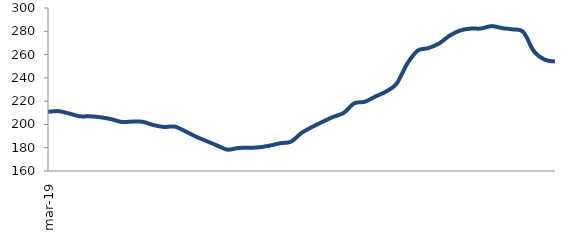
| Category | Series 0 |
|---|---|
| 2019-03-01 | 210.872 |
| 2019-04-01 | 211.394 |
| 2019-05-01 | 209.393 |
| 2019-06-01 | 207.032 |
| 2019-07-01 | 206.974 |
| 2019-08-01 | 206.107 |
| 2019-09-01 | 204.488 |
| 2019-10-01 | 202.111 |
| 2019-11-01 | 202.424 |
| 2019-12-01 | 202.177 |
| 2020-01-01 | 199.409 |
| 2020-02-01 | 197.826 |
| 2020-03-01 | 198.161 |
| 2020-04-01 | 194.123 |
| 2020-05-01 | 189.538 |
| 2020-06-01 | 185.731 |
| 2020-07-01 | 181.914 |
| 2020-08-01 | 178.343 |
| 2020-09-01 | 179.758 |
| 2020-10-01 | 179.9 |
| 2020-11-01 | 180.346 |
| 2020-12-01 | 181.827 |
| 2021-01-01 | 183.909 |
| 2021-02-01 | 185.191 |
| 2021-03-01 | 192.66 |
| 2021-04-01 | 197.814 |
| 2021-05-01 | 202.28 |
| 2021-06-01 | 206.474 |
| 2021-07-01 | 209.951 |
| 2021-08-01 | 218.146 |
| 2021-09-01 | 219.495 |
| 2021-10-01 | 224.001 |
| 2021-11-01 | 228.234 |
| 2021-12-01 | 234.966 |
| 2022-01-01 | 252.005 |
| 2022-02-01 | 263.393 |
| 2022-03-01 | 265.526 |
| 2022-04-01 | 269.383 |
| 2022-05-01 | 276.084 |
| 2022-06-01 | 280.635 |
| 2022-07-01 | 282.3 |
| 2022-08-01 | 282.377 |
| 2022-09-01 | 284.458 |
| 2022-10-01 | 282.697 |
| 2022-11-01 | 281.631 |
| 2022-12-01 | 279.359 |
| 2023-01-01 | 262.911 |
| 2023-02-01 | 255.756 |
| 2023-03-01 | 253.995 |